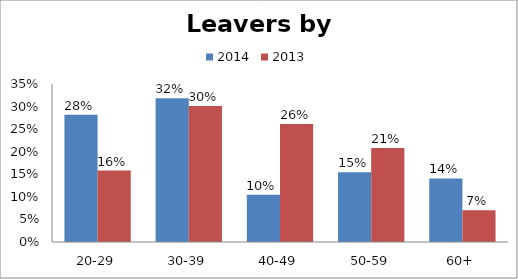
| Category | 2014 | 2013 |
|---|---|---|
| 20-29 | 0.282 | 0.158 |
| 30-39 | 0.318 | 0.301 |
| 40-49 | 0.105 | 0.262 |
| 50-59 | 0.155 | 0.208 |
| 60+ | 0.141 | 0.071 |